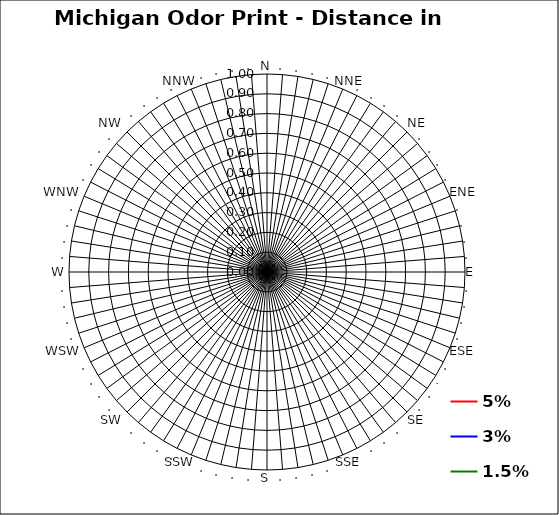
| Category | 5% | 3% | 1.5% |
|---|---|---|---|
| N | 0 | 0 | 0 |
| . | 0 | 0 | 0 |
| . | 0 | 0 | 0 |
| . | 0 | 0 | 0 |
| . | 0 | 0 | 0 |
| NNE | 0 | 0 | 0 |
| . | 0 | 0 | 0 |
| . | 0 | 0 | 0 |
| . | 0 | 0 | 0 |
| . | 0 | 0 | 0 |
| NE | 0 | 0 | 0 |
| . | 0 | 0 | 0 |
| . | 0 | 0 | 0 |
| . | 0 | 0 | 0 |
| . | 0 | 0 | 0 |
| ENE | 0 | 0 | 0 |
| . | 0 | 0 | 0 |
| . | 0 | 0 | 0 |
| . | 0 | 0 | 0 |
| . | 0 | 0 | 0 |
| E | 0 | 0 | 0 |
| . | 0 | 0 | 0 |
| . | 0 | 0 | 0 |
| . | 0 | 0 | 0 |
| . | 0 | 0 | 0 |
| ESE | 0 | 0 | 0 |
| . | 0 | 0 | 0 |
| . | 0 | 0 | 0 |
| . | 0 | 0 | 0 |
| . | 0 | 0 | 0 |
| SE | 0 | 0 | 0 |
| . | 0 | 0 | 0 |
| . | 0 | 0 | 0 |
| . | 0 | 0 | 0 |
| . | 0 | 0 | 0 |
| SSE | 0 | 0 | 0 |
| . | 0 | 0 | 0 |
| . | 0 | 0 | 0 |
| . | 0 | 0 | 0 |
| . | 0 | 0 | 0 |
| S | 0 | 0 | 0 |
| . | 0 | 0 | 0 |
| . | 0 | 0 | 0 |
| . | 0 | 0 | 0 |
| . | 0 | 0 | 0 |
| SSW | 0 | 0 | 0 |
| . | 0 | 0 | 0 |
| . | 0 | 0 | 0 |
| . | 0 | 0 | 0 |
| . | 0 | 0 | 0 |
| SW | 0 | 0 | 0 |
| . | 0 | 0 | 0 |
| . | 0 | 0 | 0 |
| . | 0 | 0 | 0 |
| . | 0 | 0 | 0 |
| WSW | 0 | 0 | 0 |
| . | 0 | 0 | 0 |
| . | 0 | 0 | 0 |
| . | 0 | 0 | 0 |
| . | 0 | 0 | 0 |
| W | 0 | 0 | 0 |
| . | 0 | 0 | 0 |
| . | 0 | 0 | 0 |
| . | 0 | 0 | 0 |
| . | 0 | 0 | 0 |
| WNW | 0 | 0 | 0 |
| . | 0 | 0 | 0 |
| . | 0 | 0 | 0 |
| . | 0 | 0 | 0 |
| . | 0 | 0 | 0 |
| NW | 0 | 0 | 0 |
| . | 0 | 0 | 0 |
| . | 0 | 0 | 0 |
| . | 0 | 0 | 0 |
| . | 0 | 0 | 0 |
| NNW | 0 | 0 | 0 |
| . | 0 | 0 | 0 |
| . | 0 | 0 | 0 |
| . | 0 | 0 | 0 |
| . | 0 | 0 | 0 |